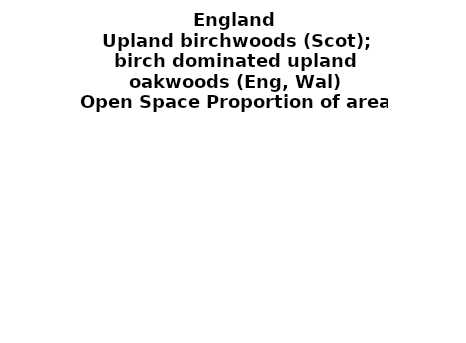
| Category | Upland birchwoods (Scot); birch dominated upland oakwoods (Eng, Wal) |
|---|---|
|  ≥ 10ha, < 10%  | 0.346 |
|   ≥ 10ha, 10-25% | 0.115 |
|   ≥ 10ha, > 25 and <50%  | 0.244 |
|   ≥ 10ha, ≥ 50%  | 0.132 |
|  < 10ha, < 10% | 0.003 |
|  < 10ha, 10-25% | 0.011 |
|  < 10ha, > 25 and < 50% | 0.06 |
|  < 10ha, ≥ 50% | 0.09 |